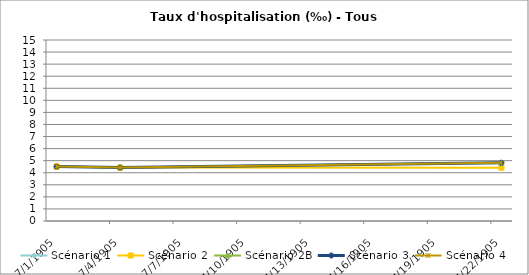
| Category | Scénario 1 | Scénario 2 | Scénario 2B | Scénario 3 | Scénario 4 |
|---|---|---|---|---|---|
| 2009.0 | 4.516 | 4.516 | 4.516 | 4.516 | 4.516 |
| 2012.0 | 4.428 | 4.428 | 4.428 | 4.428 | 4.428 |
| 2030.0 | 4.831 | 4.414 | 4.831 | 4.831 | 4.831 |